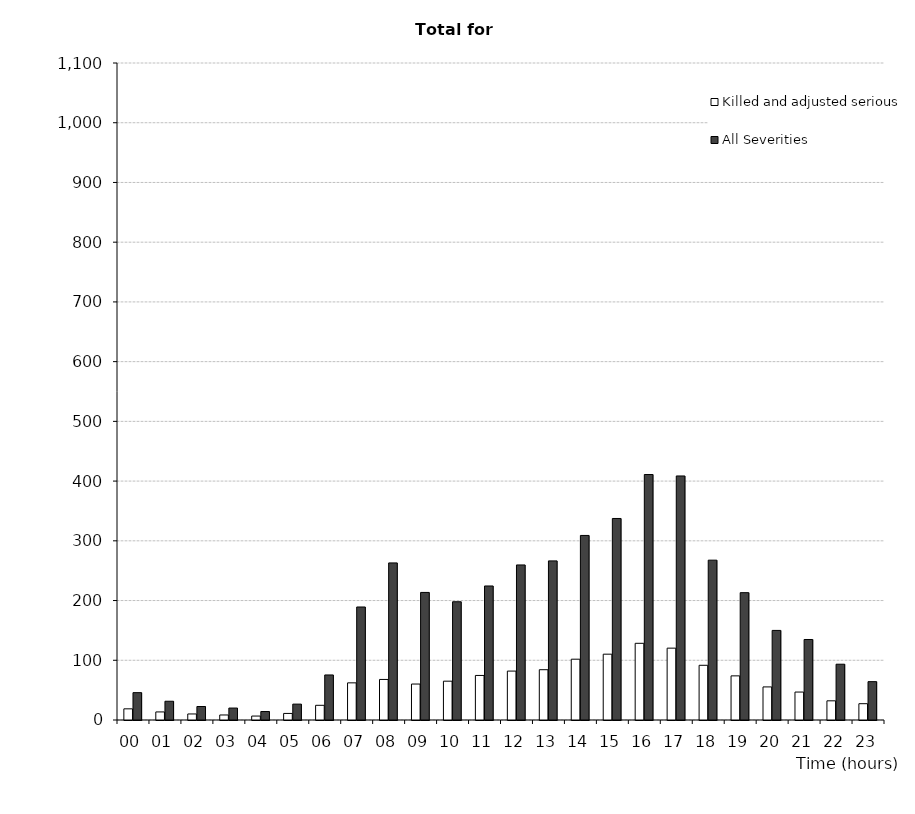
| Category | Killed and adjusted serious | All Severities |
|---|---|---|
| 00 | 18.7 | 45.8 |
| 01 | 13.5 | 31.4 |
| 02 | 10.1 | 22.6 |
| 03 | 8.4 | 20 |
| 04 | 6.6 | 14.2 |
| 05 | 11 | 26.6 |
| 06 | 24.6 | 75.4 |
| 07 | 62.2 | 189.2 |
| 08 | 67.9 | 263 |
| 09 | 60.2 | 213.6 |
| 10 | 65 | 198 |
| 11 | 74.6 | 224.4 |
| 12 | 81.9 | 259.6 |
| 13 | 84.2 | 266.4 |
| 14 | 101.8 | 309 |
| 15 | 110.2 | 337.4 |
| 16 | 128.4 | 411 |
| 17 | 120.3 | 408.6 |
| 18 | 91.6 | 267.6 |
| 19 | 73.9 | 213.2 |
| 20 | 55.4 | 150 |
| 21 | 46.8 | 134.8 |
| 22 | 32.1 | 93.4 |
| 23 | 27.3 | 64.2 |